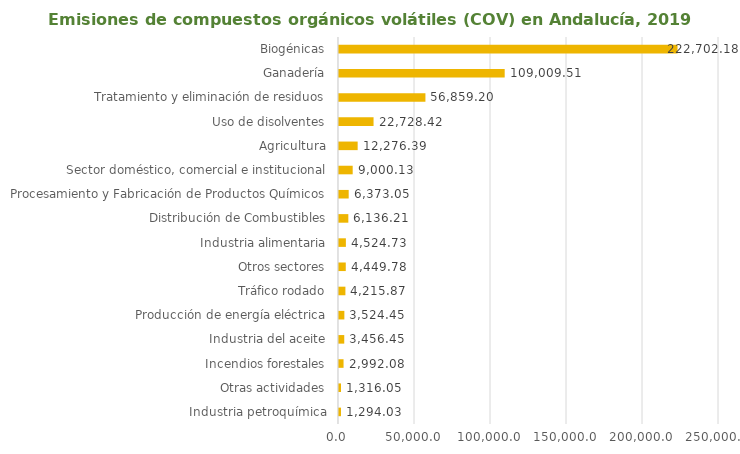
| Category | Series 0 |
|---|---|
| Biogénicas | 222702.18 |
| Ganadería | 109009.51 |
| Tratamiento y eliminación de residuos | 56859.2 |
| Uso de disolventes | 22728.42 |
| Agricultura | 12276.39 |
| Sector doméstico, comercial e institucional | 9000.13 |
| Procesamiento y Fabricación de Productos Químicos | 6373.05 |
| Distribución de Combustibles | 6136.21 |
| Industria alimentaria | 4524.73 |
| Otros sectores | 4449.78 |
| Tráfico rodado | 4215.87 |
| Producción de energía eléctrica | 3524.45 |
| Industria del aceite | 3456.45 |
| Incendios forestales | 2992.08 |
| Otras actividades | 1316.05 |
| Industria petroquímica | 1294.03 |